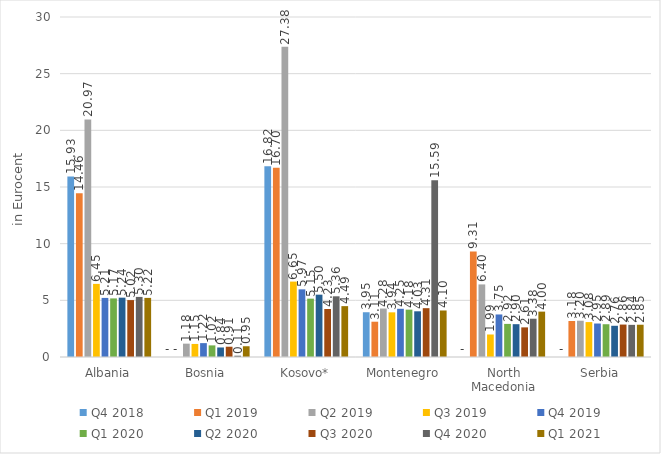
| Category | Q4 2018 | Q1 2019 | Q2 2019 | Q3 2019 | Q4 2019 | Q1 2020 | Q2 2020 | Q3 2020 | Q4 2020 | Q1 2021 |
|---|---|---|---|---|---|---|---|---|---|---|
| Albania | 15.928 | 14.458 | 20.966 | 6.451 | 5.214 | 5.17 | 5.236 | 5.021 | 5.302 | 5.215 |
| Bosnia | 0 | 0 | 1.177 | 1.153 | 1.224 | 1.025 | 0.842 | 0.907 | 0.114 | 0.948 |
| Kosovo* | 16.824 | 16.702 | 27.379 | 6.654 | 5.969 | 5.147 | 5.5 | 4.234 | 5.355 | 4.488 |
| Montenegro | 3.949 | 3.114 | 4.276 | 3.941 | 4.253 | 4.178 | 4.033 | 4.308 | 15.589 | 4.104 |
| North Macedonia | 0 | 9.309 | 6.404 | 1.986 | 3.753 | 2.92 | 2.896 | 2.614 | 3.378 | 4.004 |
| Serbia | 0 | 3.175 | 3.201 | 3.081 | 2.954 | 2.892 | 2.755 | 2.862 | 2.837 | 2.848 |